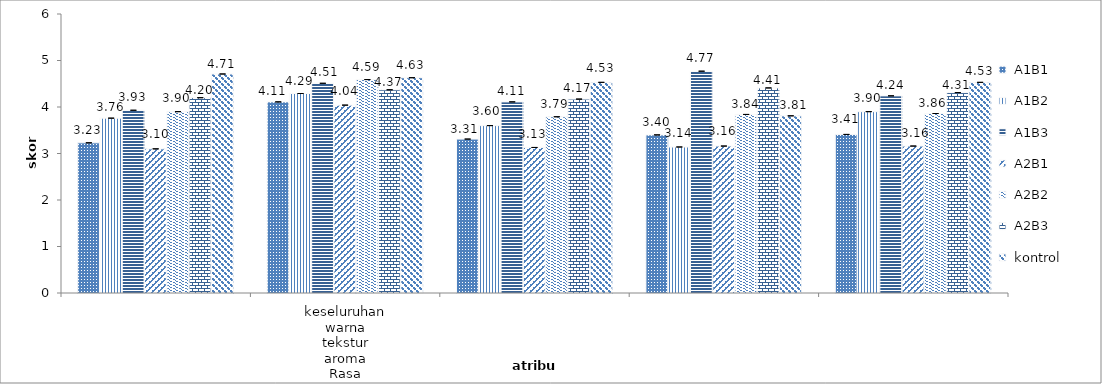
| Category | A1B1 | A1B2 | A1B3 | A2B1 | A2B2 | A2B3 | kontrol |
|---|---|---|---|---|---|---|---|
| 0 | 3.23 | 3.76 | 3.93 | 3.1 | 3.9 | 4.2 | 4.71 |
| 1 | 4.11 | 4.29 | 4.51 | 4.04 | 4.59 | 4.37 | 4.63 |
| 2 | 3.31 | 3.6 | 4.11 | 3.13 | 3.79 | 4.17 | 4.53 |
| 3 | 3.4 | 3.14 | 4.77 | 3.16 | 3.84 | 4.41 | 3.81 |
| 4 | 3.41 | 3.9 | 4.24 | 3.16 | 3.86 | 4.31 | 4.53 |